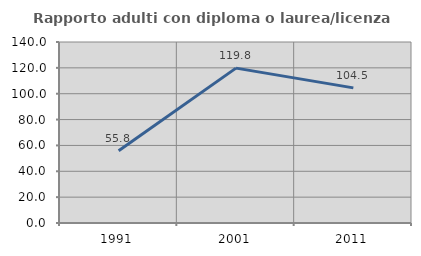
| Category | Rapporto adulti con diploma o laurea/licenza media  |
|---|---|
| 1991.0 | 55.844 |
| 2001.0 | 119.792 |
| 2011.0 | 104.511 |